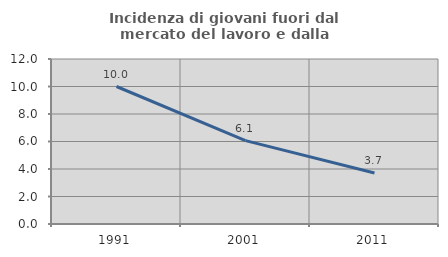
| Category | Incidenza di giovani fuori dal mercato del lavoro e dalla formazione  |
|---|---|
| 1991.0 | 10 |
| 2001.0 | 6.061 |
| 2011.0 | 3.704 |